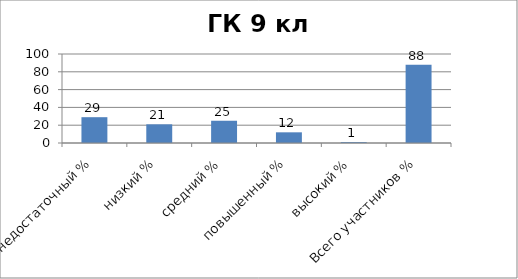
| Category | Series 0 |
|---|---|
| недостаточный % | 29 |
| низкий % | 21 |
| средний % | 25 |
| повышенный % | 12 |
| высокий % | 1 |
| Всего участников % | 88 |